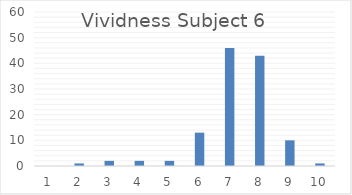
| Category | Series 0 |
|---|---|
| 0 | 0 |
| 1 | 1 |
| 2 | 2 |
| 3 | 2 |
| 4 | 2 |
| 5 | 13 |
| 6 | 46 |
| 7 | 43 |
| 8 | 10 |
| 9 | 1 |